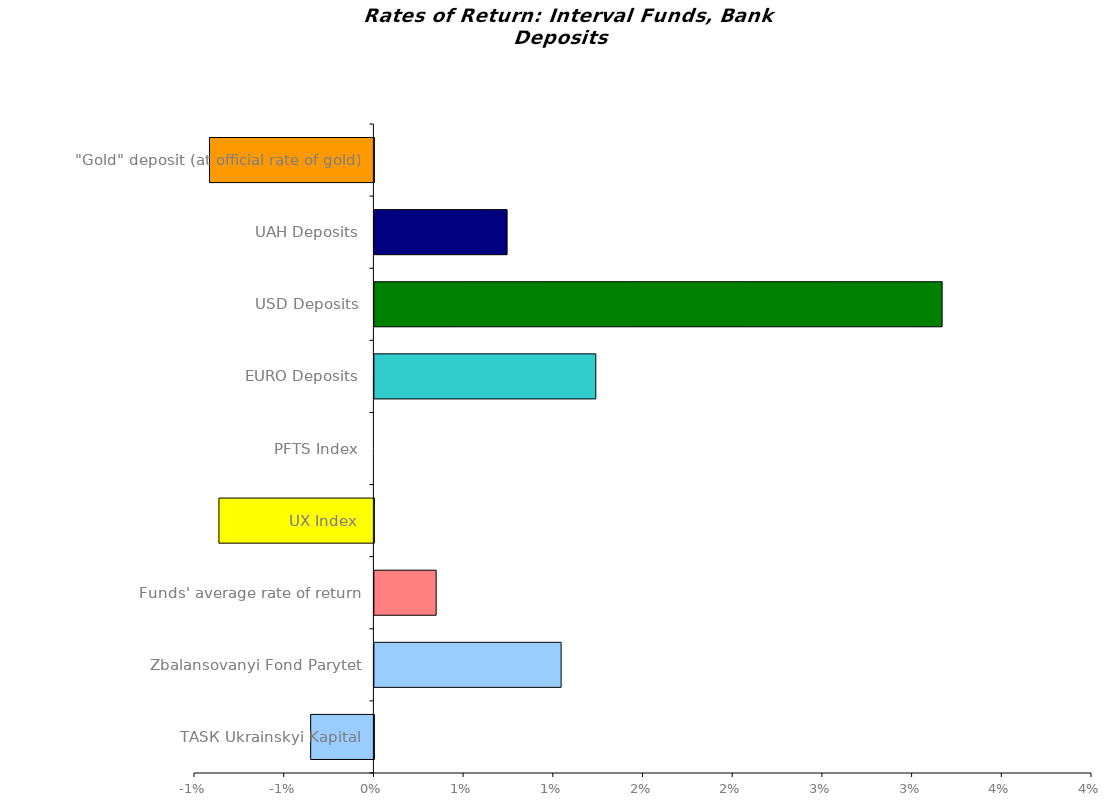
| Category | Series 0 |
|---|---|
| ТАSК Ukrainskyi Kapital | -0.004 |
| Zbalansovanyi Fond Parytet | 0.01 |
| Funds' average rate of return | 0.003 |
| UX Index | -0.009 |
| PFTS Index | 0 |
| EURO Deposits | 0.012 |
| USD Deposits | 0.032 |
| UAH Deposits | 0.007 |
| "Gold" deposit (at official rate of gold) | -0.009 |